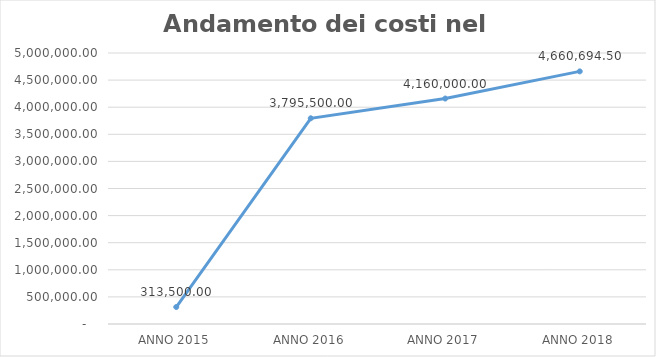
| Category | Series 0 |
|---|---|
| ANNO 2015 | 313500 |
| ANNO 2016 | 3795500 |
| ANNO 2017 | 4160000 |
| ANNO 2018 | 4660694.5 |